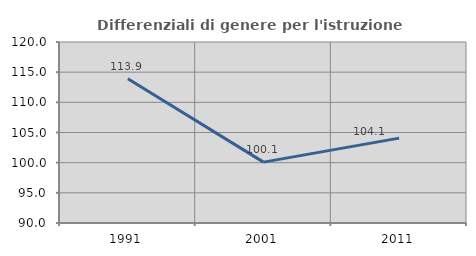
| Category | Differenziali di genere per l'istruzione superiore |
|---|---|
| 1991.0 | 113.9 |
| 2001.0 | 100.092 |
| 2011.0 | 104.067 |